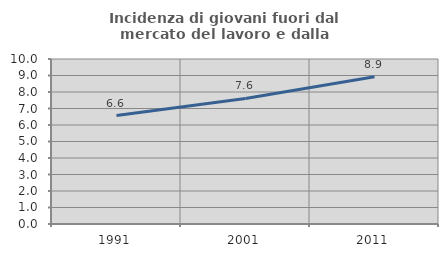
| Category | Incidenza di giovani fuori dal mercato del lavoro e dalla formazione  |
|---|---|
| 1991.0 | 6.574 |
| 2001.0 | 7.608 |
| 2011.0 | 8.922 |